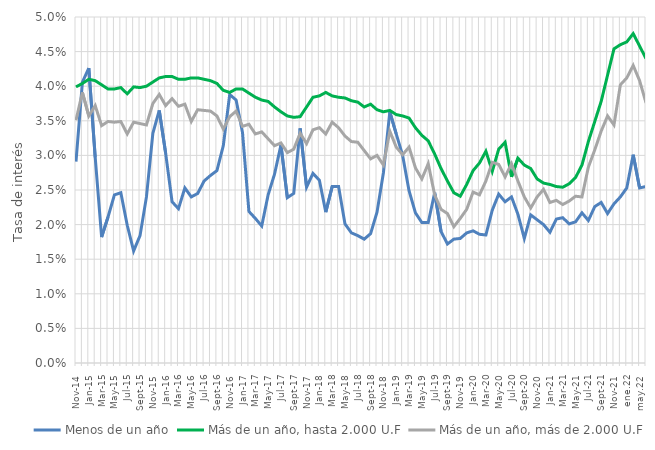
| Category | Menos de un año | Más de un año, hasta 2.000 U.F | Más de un año, más de 2.000 U.F |
|---|---|---|---|
| nov-14 | 0.029 | 0.04 | 0.035 |
| dic-14 | 0.041 | 0.04 | 0.039 |
| ene-15 | 0.043 | 0.041 | 0.036 |
| feb-15 | 0.03 | 0.041 | 0.037 |
| mar-15 | 0.018 | 0.04 | 0.034 |
| abr-15 | 0.021 | 0.04 | 0.035 |
| may-15 | 0.024 | 0.04 | 0.035 |
| jun-15 | 0.025 | 0.04 | 0.035 |
| jul-15 | 0.02 | 0.039 | 0.033 |
| ago-15 | 0.016 | 0.04 | 0.035 |
| sept-15 | 0.018 | 0.04 | 0.035 |
| oct-15 | 0.024 | 0.04 | 0.034 |
| nov-15 | 0.033 | 0.041 | 0.038 |
| dic-15 | 0.036 | 0.041 | 0.039 |
| ene-16 | 0.03 | 0.041 | 0.037 |
| feb-16 | 0.023 | 0.041 | 0.038 |
| mar-16 | 0.022 | 0.041 | 0.037 |
| abr-16 | 0.025 | 0.041 | 0.037 |
| may-16 | 0.024 | 0.041 | 0.035 |
| jun-16 | 0.024 | 0.041 | 0.037 |
| jul-16 | 0.026 | 0.041 | 0.036 |
| ago-16 | 0.027 | 0.041 | 0.036 |
| sept-16 | 0.028 | 0.04 | 0.036 |
| oct-16 | 0.031 | 0.039 | 0.034 |
| nov-16 | 0.039 | 0.039 | 0.036 |
| dic-16 | 0.038 | 0.04 | 0.036 |
| ene-17 | 0.033 | 0.04 | 0.034 |
| feb-17 | 0.022 | 0.039 | 0.034 |
| mar-17 | 0.021 | 0.038 | 0.033 |
| abr-17 | 0.02 | 0.038 | 0.033 |
| may-17 | 0.024 | 0.038 | 0.032 |
| jun-17 | 0.027 | 0.037 | 0.031 |
| jul-17 | 0.032 | 0.036 | 0.032 |
| ago-17 | 0.024 | 0.036 | 0.03 |
| sept-17 | 0.024 | 0.036 | 0.031 |
| oct-17 | 0.034 | 0.036 | 0.033 |
| nov-17 | 0.025 | 0.037 | 0.032 |
| dic-17 | 0.027 | 0.038 | 0.034 |
| ene-18 | 0.026 | 0.039 | 0.034 |
| feb-18 | 0.022 | 0.039 | 0.033 |
| mar-18 | 0.026 | 0.039 | 0.035 |
| abr-18 | 0.026 | 0.038 | 0.034 |
| may-18 | 0.02 | 0.038 | 0.033 |
| jun-18 | 0.019 | 0.038 | 0.032 |
| jul-18 | 0.018 | 0.038 | 0.032 |
| ago-18 | 0.018 | 0.037 | 0.031 |
| sept-18 | 0.019 | 0.037 | 0.03 |
| oct-18 | 0.022 | 0.037 | 0.03 |
| nov-18 | 0.028 | 0.036 | 0.029 |
| dic-18 | 0.036 | 0.036 | 0.034 |
| ene-19 | 0.033 | 0.036 | 0.031 |
| feb-19 | 0.03 | 0.036 | 0.03 |
| mar-19 | 0.025 | 0.035 | 0.031 |
| abr-19 | 0.022 | 0.034 | 0.028 |
| may-19 | 0.02 | 0.033 | 0.027 |
| jun-19 | 0.02 | 0.032 | 0.029 |
| jul-19 | 0.025 | 0.03 | 0.024 |
| ago-19 | 0.019 | 0.028 | 0.022 |
| sept-19 | 0.017 | 0.026 | 0.022 |
| oct-19 | 0.018 | 0.025 | 0.02 |
| nov-19 | 0.018 | 0.024 | 0.021 |
| dic-19 | 0.019 | 0.026 | 0.022 |
| ene-20 | 0.019 | 0.028 | 0.025 |
| feb-20 | 0.019 | 0.029 | 0.024 |
| mar-20 | 0.018 | 0.031 | 0.026 |
| abr-20 | 0.022 | 0.028 | 0.029 |
| may-20 | 0.024 | 0.031 | 0.029 |
| jun-20 | 0.023 | 0.032 | 0.027 |
| jul-20 | 0.024 | 0.027 | 0.029 |
| ago-20 | 0.022 | 0.03 | 0.026 |
| sept-20 | 0.018 | 0.029 | 0.024 |
| oct-20 | 0.021 | 0.028 | 0.022 |
| nov-20 | 0.021 | 0.027 | 0.024 |
| dic-20 | 0.02 | 0.026 | 0.025 |
| ene-21 | 0.019 | 0.026 | 0.023 |
| feb-21 | 0.021 | 0.026 | 0.024 |
| mar-21 | 0.021 | 0.025 | 0.023 |
| abr-21 | 0.02 | 0.026 | 0.023 |
| may-21 | 0.02 | 0.027 | 0.024 |
| jun-21 | 0.022 | 0.029 | 0.024 |
| jul-21 | 0.021 | 0.032 | 0.028 |
| ago-21 | 0.023 | 0.035 | 0.031 |
| sept-21 | 0.023 | 0.038 | 0.034 |
| oct-21 | 0.022 | 0.042 | 0.036 |
| nov-21 | 0.023 | 0.045 | 0.034 |
| dic-21 | 0.024 | 0.046 | 0.04 |
| ene.22 | 0.025 | 0.046 | 0.041 |
| feb-22 | 0.03 | 0.048 | 0.043 |
| may.22 | 0.025 | 0.046 | 0.041 |
| juL.22 | 0.026 | 0.044 | 0.038 |